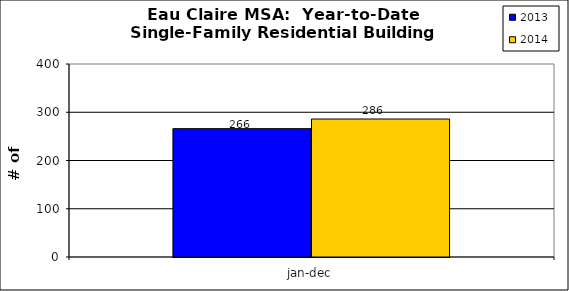
| Category | 2013 | 2014 |
|---|---|---|
| 0 | 266 | 286 |